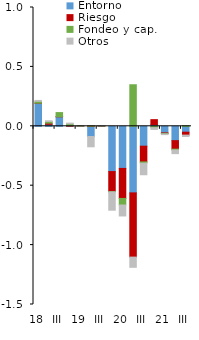
| Category | Entorno | Riesgo | Fondeo y cap. | Otros |
|---|---|---|---|---|
| 18 | 0.195 | 0.001 | 0.015 | 0.007 |
| II | 0.017 | 0.01 | 0.013 | 0.006 |
| III | 0.08 | 0 | 0.035 | 0 |
| IV | 0.002 | 0.005 | 0.014 | 0.006 |
| 19 | 0.001 | 0.001 | 0.001 | 0.001 |
| II | -0.086 | 0.001 | 0.002 | -0.087 |
| III | 0.002 | 0.001 | 0.002 | 0.002 |
| IV | -0.381 | -0.169 | -0.002 | -0.154 |
| 20 | -0.355 | -0.253 | -0.055 | -0.092 |
| II | -0.56 | -0.541 | 0.35 | -0.086 |
| III | -0.167 | -0.132 | -0.01 | -0.098 |
| IV | 0.014 | 0.042 | -0.011 | -0.015 |
| 21 | -0.055 | -0.004 | -0.005 | -0.005 |
| II | -0.121 | -0.072 | -0.007 | -0.031 |
| III | -0.05 | -0.024 | 0.004 | -0.012 |